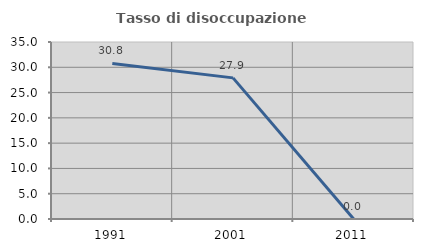
| Category | Tasso di disoccupazione giovanile  |
|---|---|
| 1991.0 | 30.769 |
| 2001.0 | 27.907 |
| 2011.0 | 0 |